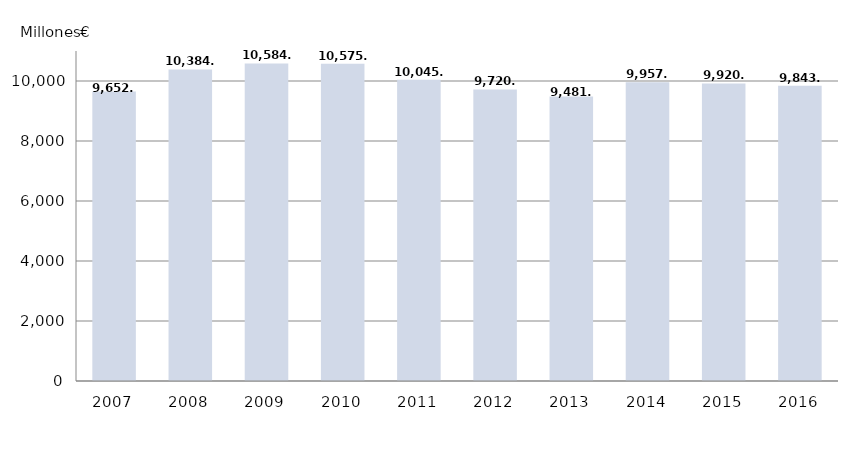
| Category | Evolución del presupuesto consolidado de la Comunidad de Castilla y León, 2007-2016 |
|---|---|
| 2007.0 | 9652452 |
| 2008.0 | 10384241.1 |
| 2009.0 | 10584541 |
| 2010.0 | 10575537 |
| 2011.0 | 10045146 |
| 2012.0 | 9720048.42 |
| 2013.0 | 9481615.09 |
| 2014.0 | 9957790.752 |
| 2015.0 | 9920811.756 |
| 2016.0 | 9843699.243 |